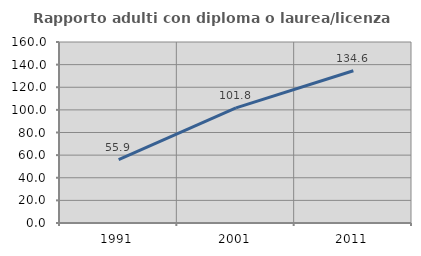
| Category | Rapporto adulti con diploma o laurea/licenza media  |
|---|---|
| 1991.0 | 55.922 |
| 2001.0 | 101.765 |
| 2011.0 | 134.618 |